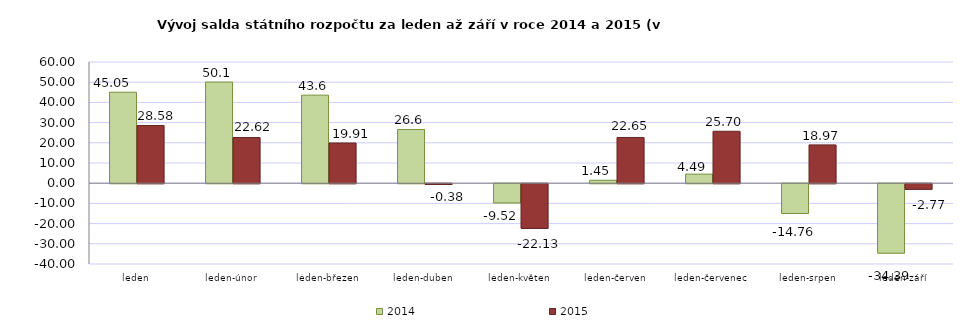
| Category | 2014 | 2015 |
|---|---|---|
| leden | 45.045 | 28.583 |
| leden-únor | 50.071 | 22.625 |
| leden-březen | 43.59 | 19.915 |
| leden-duben | 26.588 | -0.375 |
| leden-květen | -9.521 | -22.128 |
| leden-červen | 1.453 | 22.646 |
| leden-červenec | 4.49 | 25.704 |
| leden-srpen | -14.758 | 18.969 |
| leden-září | -34.391 | -2.775 |